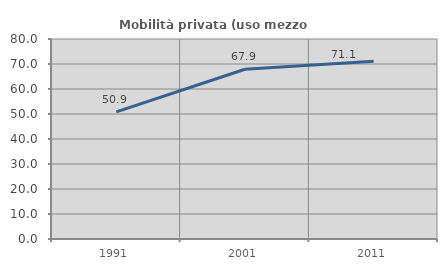
| Category | Mobilità privata (uso mezzo privato) |
|---|---|
| 1991.0 | 50.872 |
| 2001.0 | 67.895 |
| 2011.0 | 71.105 |